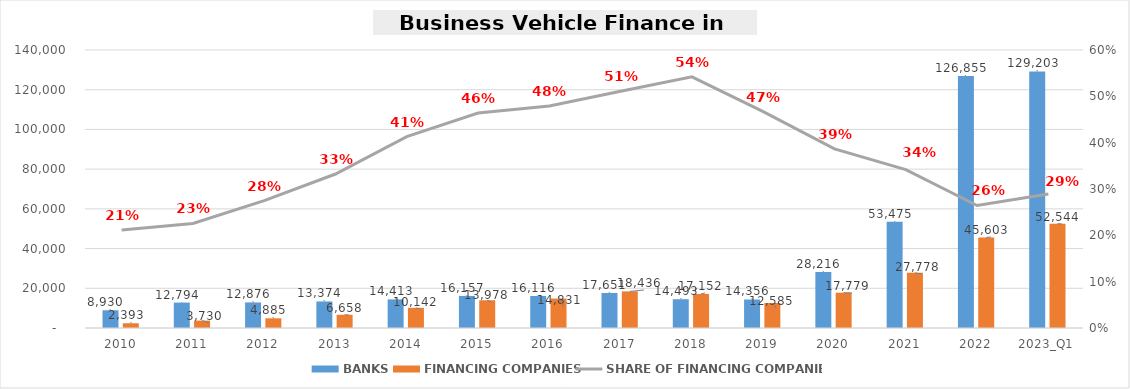
| Category | BANKS | FINANCING COMPANIES |
|---|---|---|
| 2010 | 8930.131 | 2392.721 |
| 2011 | 12793.723 | 3729.987 |
| 2012 | 12876.346 | 4885.495 |
| 2013 | 13374.424 | 6657.806 |
| 2014 | 14412.767 | 10141.887 |
| 2015 | 16157.225 | 13978.426 |
| 2016 | 16116.463 | 14831.249 |
| 2017 | 17650.963 | 18436.034 |
| 2018 | 14492.83 | 17152.034 |
| 2019 | 14355.978 | 12584.792 |
| 2020 | 28216.157 | 17779.072 |
| 2021 | 53475.488 | 27778.353 |
| 2022 | 126855.404 | 45602.871 |
| 2023_Q1 | 129203.313 | 52544.047 |